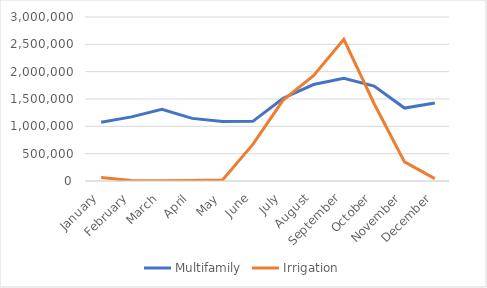
| Category | Multifamily | Irrigation |
|---|---|---|
| January | 1075500 | 62300 |
| February | 1172700 | 8100 |
| March | 1310900 | 5400 |
| April | 1145200 | 7800 |
| May | 1086400 | 17400 |
| June | 1091700 | 669500 |
| July | 1514700 | 1478900 |
| August | 1764500 | 1924800 |
| September | 1876900 | 2591900 |
| October | 1735400 | 1413700 |
| November | 1333800 | 349100 |
| December | 1428200 | 43500 |